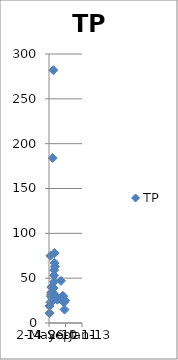
| Category | TP |
|---|---|
| 40358.0 | 30 |
| 40389.0 | 34 |
| 40400.0 | 28 |
| 40372.0 | 34 |
| 40413.0 | 25 |
| 40430.0 | 39 |
| 40441.0 | 39 |
| 40455.0 | 46 |
| 40471.0 | 78 |
| 40318.0 | 11 |
| 40556.0 | 28 |
| 40344.0 | 23 |
| 40389.0 | 28 |
| 40400.0 | 30 |
| 40400.0 | 32 |
| 40372.0 | 32 |
| 40372.0 | 40 |
| 40413.0 | 184 |
| 40413.0 | 25 |
| 40430.0 | 26 |
| 40441.0 | 33 |
| 40455.0 | 53 |
| 40471.0 | 67 |
| 40483.0 | 63 |
| 40318.0 | 19 |
| 40556.0 | 26 |
| 40663.0 | 47 |
| 40792.0 | 25 |
| 40707.0 | 30 |
| 40728.0 | 30 |
| 40749.0 | 23 |
| 40770.0 | 15 |
| 40344.0 | 75 |
| 40430.0 | 282 |
| 40441.0 | 29 |
| 40455.0 | 59 |
| 40556.0 | 27 |